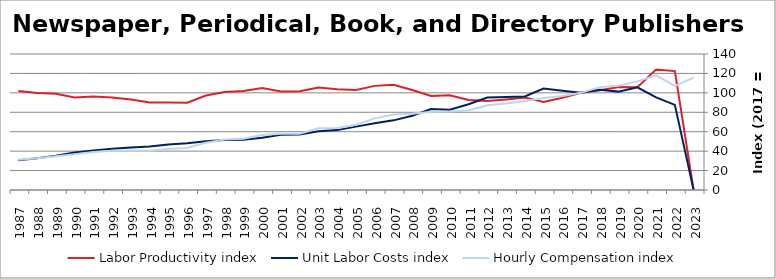
| Category | Labor Productivity index | Unit Labor Costs index | Hourly Compensation index |
|---|---|---|---|
| 2023.0 | 0 | 0 | 115.601 |
| 2022.0 | 122.417 | 87.621 | 107.262 |
| 2021.0 | 123.961 | 95.26 | 118.086 |
| 2020.0 | 105.734 | 105.765 | 111.83 |
| 2019.0 | 105.946 | 101.28 | 107.302 |
| 2018.0 | 102.582 | 103.242 | 105.907 |
| 2017.0 | 100 | 100 | 100 |
| 2016.0 | 94.93 | 102.049 | 96.875 |
| 2015.0 | 90.562 | 104.445 | 94.587 |
| 2014.0 | 95.163 | 96.332 | 91.672 |
| 2013.0 | 93.162 | 95.687 | 89.144 |
| 2012.0 | 91.514 | 95.232 | 87.151 |
| 2011.0 | 92.604 | 88.33 | 81.797 |
| 2010.0 | 97.592 | 82.717 | 80.725 |
| 2009.0 | 96.876 | 83.254 | 80.654 |
| 2008.0 | 102.861 | 76.407 | 78.593 |
| 2007.0 | 108.39 | 71.7 | 77.715 |
| 2006.0 | 107.193 | 68.787 | 73.735 |
| 2005.0 | 102.838 | 65.252 | 67.104 |
| 2004.0 | 103.739 | 61.643 | 63.948 |
| 2003.0 | 105.418 | 60.38 | 63.652 |
| 2002.0 | 101.685 | 57.043 | 58.004 |
| 2001.0 | 101.449 | 56.973 | 57.798 |
| 2000.0 | 105.059 | 53.847 | 56.571 |
| 1999.0 | 101.918 | 51.819 | 52.813 |
| 1998.0 | 100.944 | 51.495 | 51.981 |
| 1997.0 | 97.3 | 50.086 | 48.734 |
| 1996.0 | 89.939 | 48.093 | 43.255 |
| 1995.0 | 90.001 | 46.804 | 42.124 |
| 1994.0 | 90.154 | 44.739 | 40.334 |
| 1993.0 | 93.082 | 43.82 | 40.789 |
| 1992.0 | 95.304 | 42.473 | 40.478 |
| 1991.0 | 96.237 | 40.755 | 39.222 |
| 1990.0 | 95.32 | 38.507 | 36.705 |
| 1989.0 | 98.957 | 35.189 | 34.822 |
| 1988.0 | 99.894 | 32.752 | 32.718 |
| 1987.0 | 101.846 | 30.686 | 31.252 |